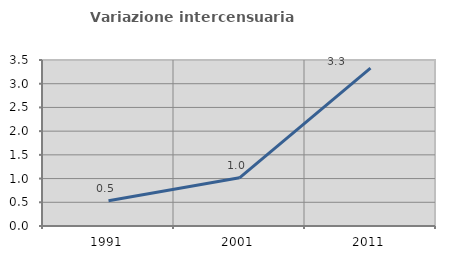
| Category | Variazione intercensuaria annua |
|---|---|
| 1991.0 | 0.533 |
| 2001.0 | 1.016 |
| 2011.0 | 3.329 |